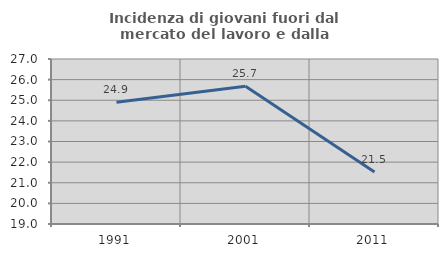
| Category | Incidenza di giovani fuori dal mercato del lavoro e dalla formazione  |
|---|---|
| 1991.0 | 24.9 |
| 2001.0 | 25.676 |
| 2011.0 | 21.522 |